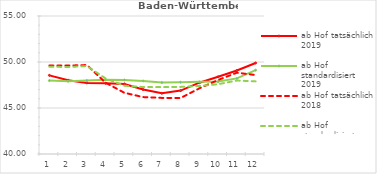
| Category | ab Hof tatsächlich 2019 | ab Hof standardisiert 2019 | ab Hof tatsächlich 2018 | ab Hof standardisiert 2018 |
|---|---|---|---|---|
| 0 | 48.549 | 47.979 | 49.615 | 49.491 |
| 1 | 48.02 | 47.911 | 49.613 | 49.454 |
| 2 | 47.729 | 47.979 | 49.668 | 49.562 |
| 3 | 47.679 | 48.073 | 47.748 | 48.211 |
| 4 | 47.618 | 48.049 | 46.655 | 47.422 |
| 5 | 47.006 | 47.94 | 46.186 | 47.278 |
| 6 | 46.602 | 47.771 | 46.097 | 47.268 |
| 7 | 46.893 | 47.796 | 46.085 | 47.294 |
| 8 | 47.752 | 47.84 | 47.135 | 47.389 |
| 9 | 48.394 | 47.869 | 48.047 | 47.587 |
| 10 | 49.075 | 48.218 | 48.837 | 47.985 |
| 11 | 49.893 | 49.114 | 48.583 | 47.894 |